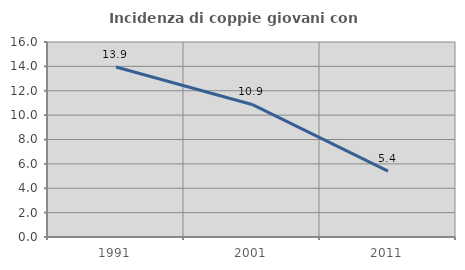
| Category | Incidenza di coppie giovani con figli |
|---|---|
| 1991.0 | 13.948 |
| 2001.0 | 10.875 |
| 2011.0 | 5.398 |